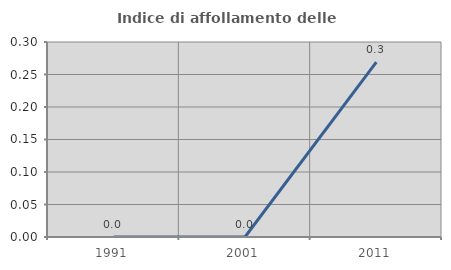
| Category | Indice di affollamento delle abitazioni  |
|---|---|
| 1991.0 | 0 |
| 2001.0 | 0 |
| 2011.0 | 0.269 |